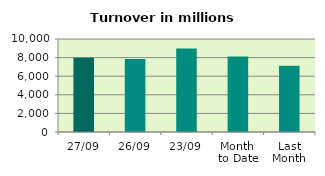
| Category | Series 0 |
|---|---|
| 27/09 | 7985.777 |
| 26/09 | 7847.406 |
| 23/09 | 8982.08 |
| Month 
to Date | 8110.814 |
| Last
Month | 7128.729 |